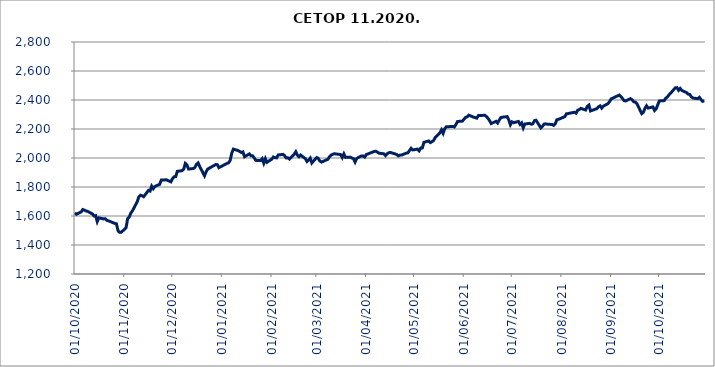
| Category | CETOP |
|---|---|
| 01/10/2020 | 1621.82 |
| 02/10/2020 | 1612.25 |
| 05/10/2020 | 1628.6 |
| 06/10/2020 | 1644.52 |
| 07/10/2020 | 1640.1 |
| 08/10/2020 | 1635.1 |
| 09/10/2020 | 1631.81 |
| 12/10/2020 | 1614.4 |
| 13/10/2020 | 1600.31 |
| 14/10/2020 | 1602.42 |
| 15/10/2020 | 1561.73 |
| 16/10/2020 | 1587.3 |
| 19/10/2020 | 1579.8 |
| 20/10/2020 | 1581.44 |
| 21/10/2020 | 1570.12 |
| 22/10/2020 | 1566.79 |
| 26/10/2020 | 1548.79 |
| 27/10/2020 | 1546.15 |
| 28/10/2020 | 1498.86 |
| 29/10/2020 | 1487.64 |
| 30/10/2020 | 1487.52 |
| 02/11/2020 | 1519.19 |
| 03/11/2020 | 1581.46 |
| 04/11/2020 | 1593.28 |
| 05/11/2020 | 1620.79 |
| 06/11/2020 | 1635.85 |
| 09/11/2020 | 1699.08 |
| 10/11/2020 | 1732.26 |
| 11/11/2020 | 1743.66 |
| 12/11/2020 | 1739.7 |
| 13/11/2020 | 1733.07 |
| 16/11/2020 | 1776.66 |
| 17/11/2020 | 1772.01 |
| 18/11/2020 | 1805.8 |
| 19/11/2020 | 1788.54 |
| 20/11/2020 | 1803.8 |
| 23/11/2020 | 1818.56 |
| 24/11/2020 | 1848.16 |
| 25/11/2020 | 1847.99 |
| 26/11/2020 | 1848.47 |
| 27/11/2020 | 1850.47 |
| 30/11/2020 | 1835.59 |
| 01/12/2020 | 1857.61 |
| 02/12/2020 | 1870.38 |
| 03/12/2020 | 1871.91 |
| 04/12/2020 | 1907.87 |
| 07/12/2020 | 1912.65 |
| 08/12/2020 | 1922.85 |
| 09/12/2020 | 1962.8 |
| 10/12/2020 | 1952.45 |
| 11/12/2020 | 1923.82 |
| 14/12/2020 | 1927.53 |
| 15/12/2020 | 1935.14 |
| 16/12/2020 | 1956.56 |
| 17/12/2020 | 1965.92 |
| 18/12/2020 | 1940.88 |
| 21/12/2020 | 1877.07 |
| 22/12/2020 | 1904.82 |
| 23/12/2020 | 1923.84 |
| 28/12/2020 | 1954.78 |
| 29/12/2020 | 1954.29 |
| 30/12/2020 | 1933.266 |
| 04/01/2021 | 1962.73 |
| 05/01/2021 | 1966.43 |
| 06/01/2021 | 1983.41 |
| 07/01/2021 | 2033.28 |
| 08/01/2021 | 2061.34 |
| 11/01/2021 | 2051.33 |
| 12/01/2021 | 2044.47 |
| 13/01/2021 | 2037.86 |
| 14/01/2021 | 2042.29 |
| 15/01/2021 | 2009.01 |
| 18/01/2021 | 2028.23 |
| 19/01/2021 | 2015.22 |
| 20/01/2021 | 2015.5 |
| 21/01/2021 | 2001.38 |
| 22/01/2021 | 1983.77 |
| 25/01/2021 | 1982.05 |
| 26/01/2021 | 1995.48 |
| 27/01/2021 | 1964.21 |
| 28/01/2021 | 1995.54 |
| 29/01/2021 | 1970.38 |
| 01/02/2021 | 1991.99 |
| 02/02/2021 | 2007.22 |
| 03/02/2021 | 2001.98 |
| 04/02/2021 | 2000.87 |
| 05/02/2021 | 2021.06 |
| 08/02/2021 | 2024.95 |
| 09/02/2021 | 2016.39 |
| 10/02/2021 | 2000.46 |
| 11/02/2021 | 2001.9 |
| 12/02/2021 | 1993.13 |
| 15/02/2021 | 2026.16 |
| 16/02/2021 | 2043.11 |
| 17/02/2021 | 2019.49 |
| 18/02/2021 | 2009.18 |
| 19/02/2021 | 2020.59 |
| 22/02/2021 | 1995 |
| 23/02/2021 | 1975.92 |
| 24/02/2021 | 1985.63 |
| 25/02/2021 | 1998.97 |
| 26/02/2021 | 1965.68 |
| 01/03/2021 | 2003.02 |
| 02/03/2021 | 1998.07 |
| 03/03/2021 | 1979.09 |
| 04/03/2021 | 1971.77 |
| 05/03/2021 | 1976.6 |
| 08/03/2021 | 1990.9 |
| 09/03/2021 | 2008.59 |
| 10/03/2021 | 2019.29 |
| 11/03/2021 | 2025.26 |
| 12/03/2021 | 2029.51 |
| 16/03/2021 | 2023.5 |
| 17/03/2021 | 2003.29 |
| 18/03/2021 | 2028.11 |
| 19/03/2021 | 2004.22 |
| 22/03/2021 | 2006.02 |
| 23/03/2021 | 1999.63 |
| 24/03/2021 | 1995.8 |
| 25/03/2021 | 1972.27 |
| 26/03/2021 | 1997.05 |
| 29/03/2021 | 2014.18 |
| 30/03/2021 | 2013.83 |
| 31/03/2021 | 2006.45 |
| 01/04/2021 | 2023.58 |
| 06/04/2021 | 2045.4 |
| 07/04/2021 | 2046.41 |
| 08/04/2021 | 2039.84 |
| 09/04/2021 | 2033.25 |
| 12/04/2021 | 2028.9 |
| 13/04/2021 | 2016.66 |
| 14/04/2021 | 2029.14 |
| 15/04/2021 | 2035.89 |
| 16/04/2021 | 2038.42 |
| 19/04/2021 | 2028.01 |
| 20/04/2021 | 2024 |
| 21/04/2021 | 2014.62 |
| 22/04/2021 | 2019.58 |
| 23/04/2021 | 2020.23 |
| 26/04/2021 | 2033.61 |
| 27/04/2021 | 2035.8 |
| 28/04/2021 | 2052.04 |
| 29/04/2021 | 2067.11 |
| 30/04/2021 | 2055.6 |
| 03/05/2021 | 2061.01 |
| 04/05/2021 | 2049.53 |
| 05/05/2021 | 2068.79 |
| 06/05/2021 | 2069.54 |
| 07/05/2021 | 2108.14 |
| 10/05/2021 | 2117.62 |
| 11/05/2021 | 2105.93 |
| 12/05/2021 | 2112.74 |
| 13/05/2021 | 2119.92 |
| 14/05/2021 | 2139.97 |
| 17/05/2021 | 2174.57 |
| 18/05/2021 | 2194.7 |
| 19/05/2021 | 2170.62 |
| 20/05/2021 | 2202.26 |
| 21/05/2021 | 2215.55 |
| 25/05/2021 | 2217.23 |
| 26/05/2021 | 2214.13 |
| 27/05/2021 | 2231.31 |
| 28/05/2021 | 2251.68 |
| 31/05/2021 | 2254.36 |
| 01/06/2021 | 2267.05 |
| 02/06/2021 | 2280.22 |
| 03/06/2021 | 2284.16 |
| 04/06/2021 | 2295.68 |
| 07/06/2021 | 2281.71 |
| 08/06/2021 | 2278.76 |
| 09/06/2021 | 2274.78 |
| 10/06/2021 | 2292.52 |
| 11/06/2021 | 2293.04 |
| 14/06/2021 | 2294.68 |
| 15/06/2021 | 2286.29 |
| 16/06/2021 | 2273.35 |
| 17/06/2021 | 2257.3 |
| 18/06/2021 | 2237.18 |
| 21/06/2021 | 2253.1 |
| 22/06/2021 | 2241.35 |
| 23/06/2021 | 2260.73 |
| 24/06/2021 | 2278.2 |
| 25/06/2021 | 2281.37 |
| 28/06/2021 | 2285.26 |
| 29/06/2021 | 2261.99 |
| 30/06/2021 | 2229.26 |
| 01/07/2021 | 2249.46 |
| 02/07/2021 | 2243.67 |
| 05/07/2021 | 2252.04 |
| 06/07/2021 | 2231.68 |
| 07/07/2021 | 2241.97 |
| 08/07/2021 | 2207.81 |
| 09/07/2021 | 2234.45 |
| 12/07/2021 | 2238.84 |
| 13/07/2021 | 2232.86 |
| 14/07/2021 | 2235.51 |
| 15/07/2021 | 2257.74 |
| 16/07/2021 | 2260.51 |
| 19/07/2021 | 2207.64 |
| 20/07/2021 | 2217.89 |
| 21/07/2021 | 2233.92 |
| 22/07/2021 | 2235.73 |
| 23/07/2021 | 2232.84 |
| 26/07/2021 | 2231.29 |
| 27/07/2021 | 2225.16 |
| 28/07/2021 | 2235.92 |
| 29/07/2021 | 2264.07 |
| 30/07/2021 | 2266.62 |
| 02/08/2021 | 2280.58 |
| 03/08/2021 | 2285.5 |
| 04/08/2021 | 2304.99 |
| 05/08/2021 | 2306.32 |
| 06/08/2021 | 2309.02 |
| 09/08/2021 | 2315.44 |
| 10/08/2021 | 2308.61 |
| 11/08/2021 | 2329.15 |
| 12/08/2021 | 2334.42 |
| 13/08/2021 | 2341.91 |
| 16/08/2021 | 2330.99 |
| 17/08/2021 | 2356.38 |
| 18/08/2021 | 2364.72 |
| 19/08/2021 | 2324.29 |
| 23/08/2021 | 2340.76 |
| 24/08/2021 | 2353.36 |
| 25/08/2021 | 2360.03 |
| 26/08/2021 | 2343.94 |
| 27/08/2021 | 2357.33 |
| 30/08/2021 | 2375.41 |
| 31/08/2021 | 2390.41 |
| 01/09/2021 | 2408.72 |
| 02/09/2021 | 2412.64 |
| 03/09/2021 | 2418.55 |
| 06/09/2021 | 2434.27 |
| 07/09/2021 | 2423.33 |
| 08/09/2021 | 2410.33 |
| 09/09/2021 | 2395.53 |
| 10/09/2021 | 2393.5 |
| 13/09/2021 | 2409.5 |
| 14/09/2021 | 2401.55 |
| 15/09/2021 | 2387.77 |
| 16/09/2021 | 2385.41 |
| 17/09/2021 | 2374.54 |
| 20/09/2021 | 2305.89 |
| 21/09/2021 | 2315.21 |
| 22/09/2021 | 2342.42 |
| 23/09/2021 | 2359.97 |
| 24/09/2021 | 2344.48 |
| 27/09/2021 | 2351.98 |
| 28/09/2021 | 2327.67 |
| 29/09/2021 | 2338.97 |
| 30/09/2021 | 2366.72 |
| 01/10/2021 | 2393.57 |
| 04/10/2021 | 2395.65 |
| 05/10/2021 | 2412.26 |
| 06/10/2021 | 2420.8 |
| 07/10/2021 | 2435.1 |
| 08/10/2021 | 2446.44 |
| 11/10/2021 | 2484.56 |
| 12/10/2021 | 2485.3 |
| 13/10/2021 | 2466.98 |
| 14/10/2021 | 2479.55 |
| 15/10/2021 | 2465.98 |
| 18/10/2021 | 2451.12 |
| 19/10/2021 | 2440.7 |
| 20/10/2021 | 2438.13 |
| 21/10/2021 | 2420.78 |
| 22/10/2021 | 2413.74 |
| 25/10/2021 | 2409.22 |
| 26/10/2021 | 2418.34 |
| 27/10/2021 | 2403.14 |
| 28/10/2021 | 2390.55 |
| 29/10/2021 | 2394.99 |